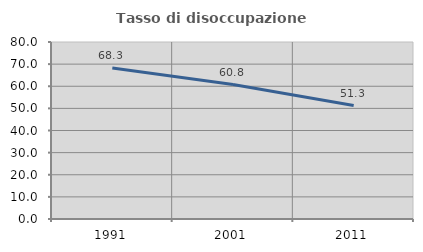
| Category | Tasso di disoccupazione giovanile  |
|---|---|
| 1991.0 | 68.277 |
| 2001.0 | 60.754 |
| 2011.0 | 51.289 |